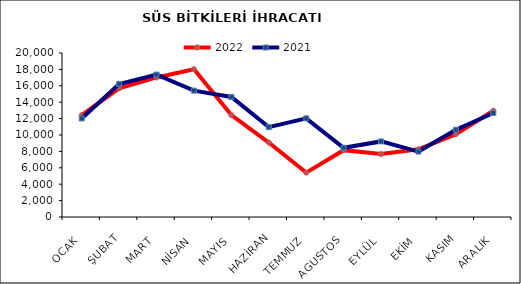
| Category | 2022 | 2021 |
|---|---|---|
| OCAK | 12415.091 | 12015.773 |
| ŞUBAT | 15693.365 | 16226.111 |
| MART | 17018.631 | 17369.886 |
| NİSAN | 18025.693 | 15412.279 |
| MAYIS | 12424.482 | 14638.275 |
| HAZİRAN | 9079.773 | 10961.588 |
| TEMMUZ | 5411.485 | 12028.239 |
| AGUSTOS | 8150.752 | 8439.406 |
| EYLÜL | 7678.155 | 9218.288 |
| EKİM | 8254.692 | 7979.695 |
| KASIM | 10095.65 | 10633.564 |
| ARALIK | 12952.768 | 12679.339 |